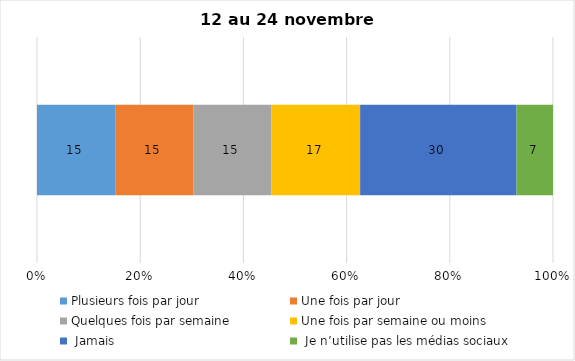
| Category | Plusieurs fois par jour | Une fois par jour | Quelques fois par semaine   | Une fois par semaine ou moins   |  Jamais   |  Je n’utilise pas les médias sociaux |
|---|---|---|---|---|---|---|
| 0 | 15 | 15 | 15 | 17 | 30 | 7 |